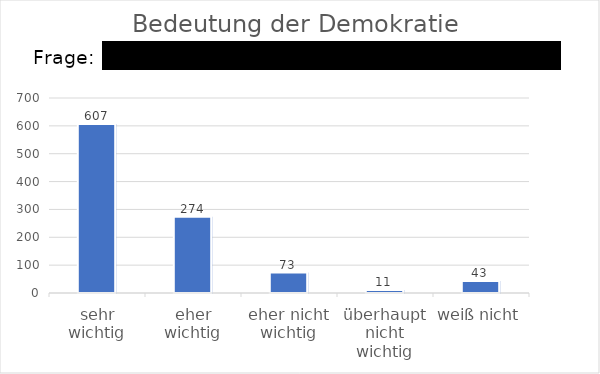
| Category | Bedeutung der Demokratie |
|---|---|
| sehr wichtig | 606.53 |
| eher wichtig | 273.943 |
| eher nicht wichtig | 73.416 |
| überhaupt nicht wichtig | 10.621 |
| weiß nicht | 42.809 |